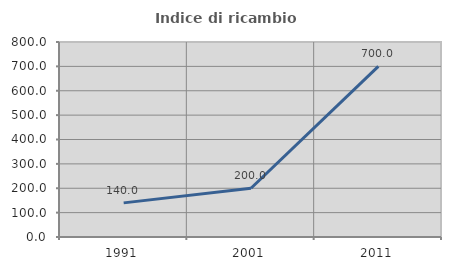
| Category | Indice di ricambio occupazionale  |
|---|---|
| 1991.0 | 140 |
| 2001.0 | 200 |
| 2011.0 | 700 |